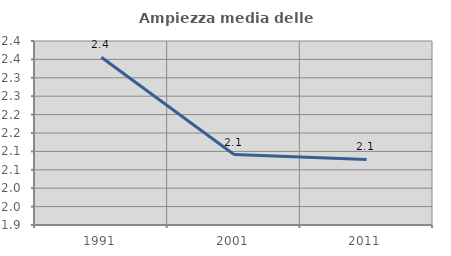
| Category | Ampiezza media delle famiglie |
|---|---|
| 1991.0 | 2.356 |
| 2001.0 | 2.091 |
| 2011.0 | 2.078 |